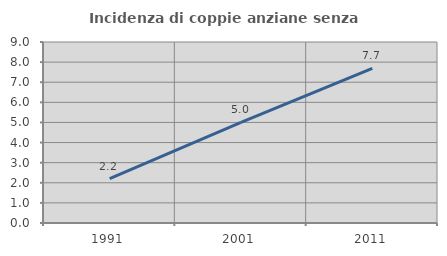
| Category | Incidenza di coppie anziane senza figli  |
|---|---|
| 1991.0 | 2.211 |
| 2001.0 | 5 |
| 2011.0 | 7.692 |